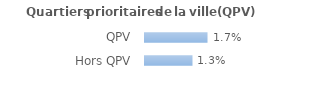
| Category | Series 0 |
|---|---|
| QPV | 0.017 |
| Hors QPV | 0.013 |